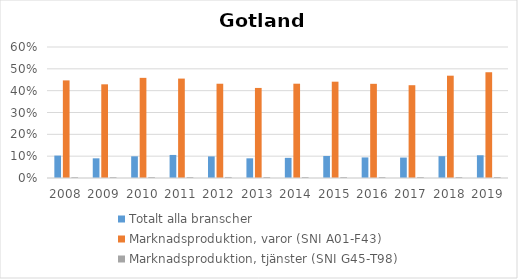
| Category | Totalt alla branscher | Marknadsproduktion, varor (SNI A01-F43) | Marknadsproduktion, tjänster (SNI G45-T98) |
|---|---|---|---|
| 2008 | 0.103 | 0.447 | 0.004 |
| 2009 | 0.09 | 0.429 | 0.004 |
| 2010 | 0.099 | 0.459 | 0.005 |
| 2011 | 0.106 | 0.455 | 0.005 |
| 2012 | 0.099 | 0.432 | 0.005 |
| 2013 | 0.09 | 0.412 | 0.005 |
| 2014 | 0.092 | 0.432 | 0.004 |
| 2015 | 0.101 | 0.441 | 0.005 |
| 2016 | 0.094 | 0.431 | 0.005 |
| 2017 | 0.094 | 0.425 | 0.005 |
| 2018 | 0.1 | 0.469 | 0.005 |
| 2019 | 0.104 | 0.484 | 0.005 |